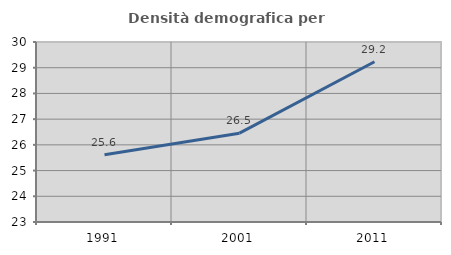
| Category | Densità demografica |
|---|---|
| 1991.0 | 25.615 |
| 2001.0 | 26.454 |
| 2011.0 | 29.233 |